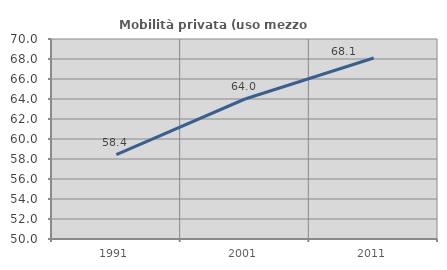
| Category | Mobilità privata (uso mezzo privato) |
|---|---|
| 1991.0 | 58.443 |
| 2001.0 | 64 |
| 2011.0 | 68.095 |